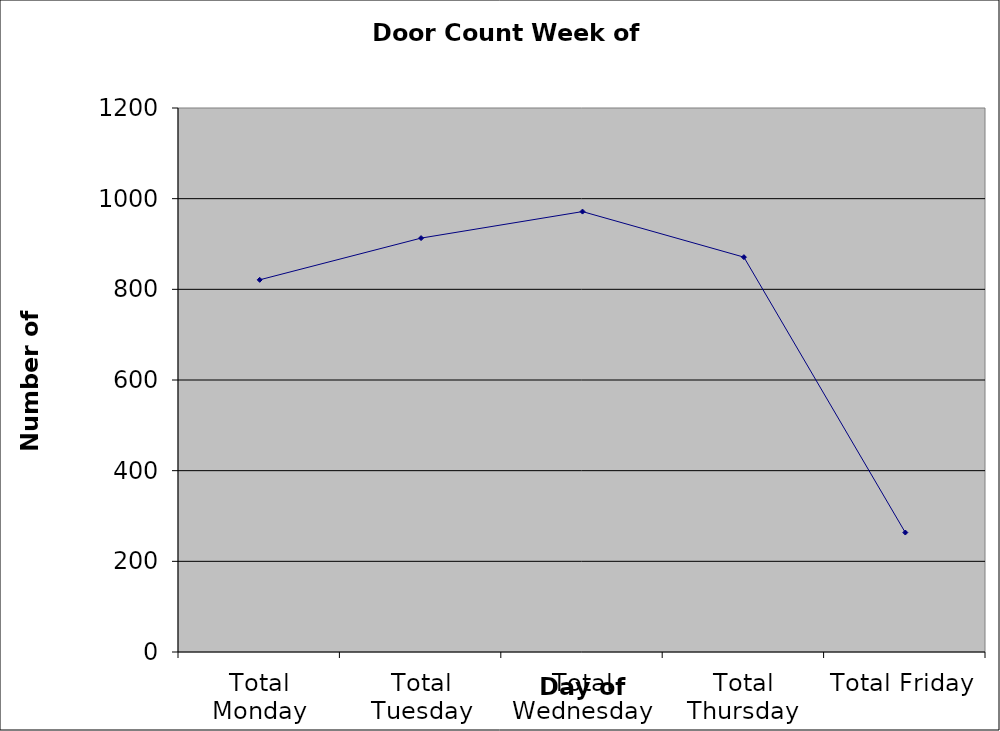
| Category | Series 0 |
|---|---|
| Total Monday | 821 |
| Total Tuesday | 913 |
| Total Wednesday | 971.5 |
| Total Thursday | 871 |
| Total Friday | 263.5 |